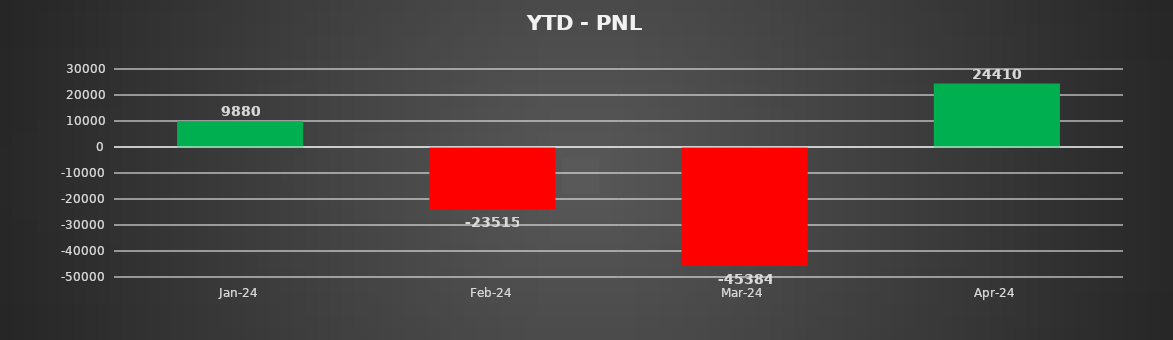
| Category | Series 1 |
|---|---|
| 2024-01-01 | 9880 |
| 2024-02-01 | -23515 |
| 2024-03-01 | -45383.75 |
| 2024-04-01 | 24410 |